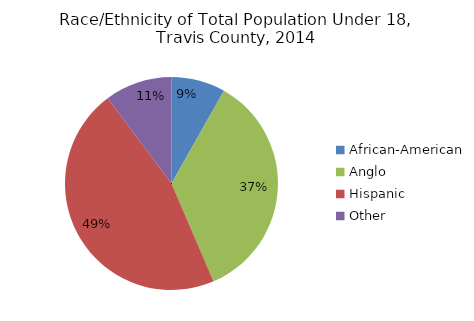
| Category | Series 0 |
|---|---|
| African-American | 0.087 |
| Anglo | 0.374 |
| Hispanic | 0.49 |
| Other | 0.108 |